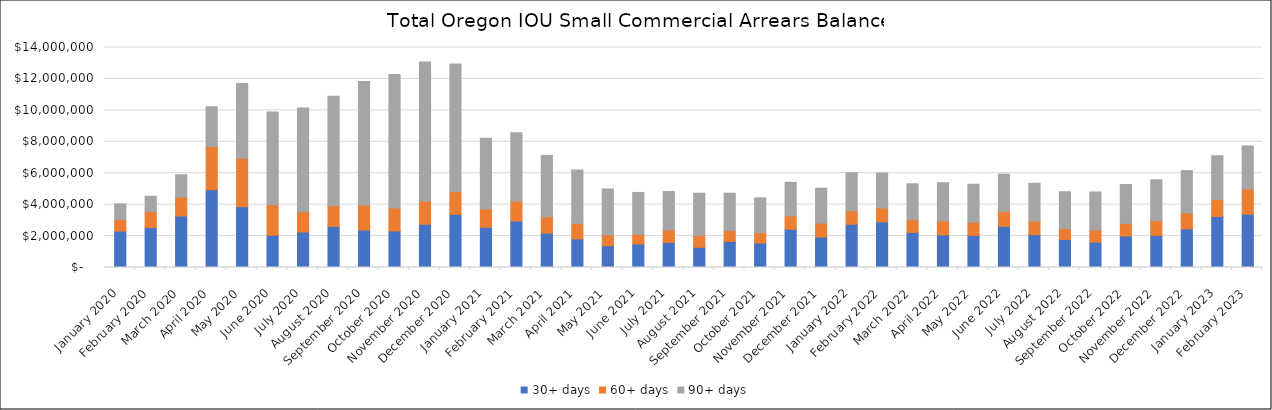
| Category | 30+ days | 60+ days | 90+ days |
|---|---|---|---|
| 2020-01-01 | 2316158.18 | 733035.56 | 1001104.79 |
| 2020-02-01 | 2544655.45 | 1002587.01 | 988761.68 |
| 2020-03-01 | 3280282.89 | 1194318.76 | 1429150.62 |
| 2020-04-01 | 4953532.97 | 2743196.2 | 2536109.9 |
| 2020-05-01 | 3875730.99 | 3083645.03 | 4742225.03 |
| 2020-06-01 | 2056104.75 | 1930378.8 | 5916193.06 |
| 2020-07-01 | 2254753.75 | 1294006.82 | 6594004.56 |
| 2020-08-01 | 2616545 | 1319436.08 | 6968769.54 |
| 2020-09-01 | 2385347.88 | 1593232.23 | 7863117.12 |
| 2020-10-01 | 2324020.87 | 1461866.09 | 8490530.77 |
| 2020-11-01 | 2752989.76 | 1486777.25 | 8843366.83 |
| 2020-12-01 | 3381523.34 | 1460992.83 | 8106339.68 |
| 2021-01-01 | 2558283.7 | 1163564.73 | 4503490.68 |
| 2021-02-01 | 2958105.02 | 1257040.89 | 4363122.34 |
| 2021-03-01 | 2190009.44 | 1038283.22 | 3906810.31 |
| 2021-04-01 | 1820994.79 | 983051.48 | 3398337.56 |
| 2021-05-01 | 1383951.04 | 688047.97 | 2927280.49 |
| 2021-06-01 | 1495629.25 | 615256.87 | 2665263.48 |
| 2021-07-01 | 1592502.35 | 800442.89 | 2442567.43 |
| 2021-08-01 | 1284308.09 | 765527.84 | 2677694.87 |
| 2021-09-01 | 1655186.09 | 696766.69 | 2374789.08 |
| 2021-10-01 | 1559095.41 | 658972.25 | 2215220.49 |
| 2021-11-01 | 2433755.54 | 844660.48 | 2139690.32 |
| 2021-12-01 | 1939692.51 | 886409.4 | 2220314.32 |
| 2022-01-01 | 2752362.5 | 853907.31 | 2424005.18 |
| 2022-02-01 | 2912540.79 | 871416.85 | 2233874.23 |
| 2022-03-01 | 2231323.13 | 803506.05 | 2294437.13 |
| 2022-04-01 | 2077428.72 | 879427.14 | 2440421.38 |
| 2022-05-01 | 2047415.27 | 826787.75 | 2424055.19 |
| 2022-06-01 | 2617610.39 | 953872.33 | 2372442.95 |
| 2022-07-01 | 2090208.21 | 856968.21 | 2413623.24 |
| 2022-08-01 | 1778886.43 | 694121.28 | 2349289.99 |
| 2022-09-01 | 1616012.72 | 772025.09 | 2420198.45 |
| 2022-10-01 | 2007906.09 | 802545.73 | 2471107.46 |
| 2022-11-01 | 2046701.57 | 937052.18 | 2596185.97 |
| 2022-12-01 | 2456603.54 | 1020709.41 | 2689072.72 |
| 2023-01-01 | 3247149.39 | 1077247.77 | 2787861.76 |
| 2023-02-01 | 3391054.37 | 1589376.06 | 2754934.69 |